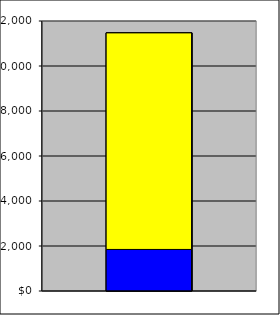
| Category | Series 0 | Series 1 |
|---|---|---|
| 0 | 1846.933 | 9624.967 |